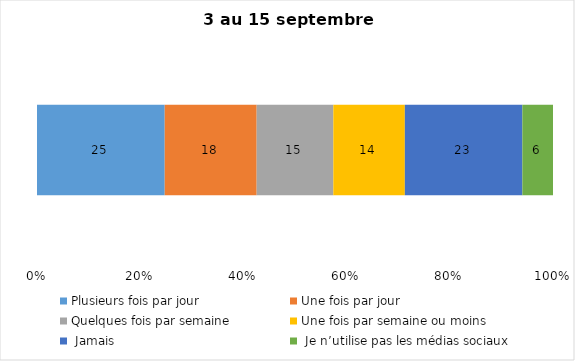
| Category | Plusieurs fois par jour | Une fois par jour | Quelques fois par semaine   | Une fois par semaine ou moins   |  Jamais   |  Je n’utilise pas les médias sociaux |
|---|---|---|---|---|---|---|
| 0 | 25 | 18 | 15 | 14 | 23 | 6 |